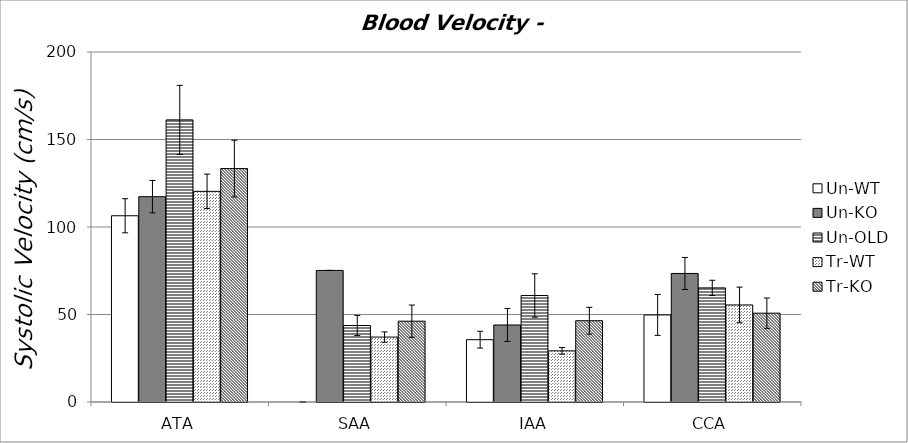
| Category | Un-WT | Un-KO | Un-OLD | Tr-WT | Tr-KO |
|---|---|---|---|---|---|
| 0 | 106.425 | 117.336 | 161.207 | 120.367 | 133.382 |
| 1 | 0 | 75.181 | 43.722 | 37.103 | 46.18 |
| 2 | 35.614 | 43.994 | 60.852 | 29.228 | 46.45 |
| 3 | 49.747 | 73.447 | 65.214 | 55.462 | 50.752 |